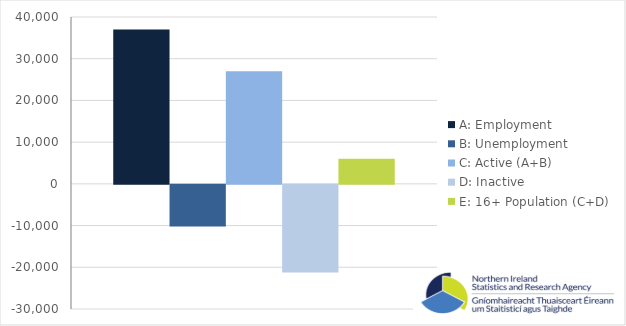
| Category | A: Employment | B: Unemployment | C: Active (A+B) | D: Inactive | E: 16+ Population (C+D) |
|---|---|---|---|---|---|
| 0 | 37000 | -10000 | 27000 | -21000 | 6000 |